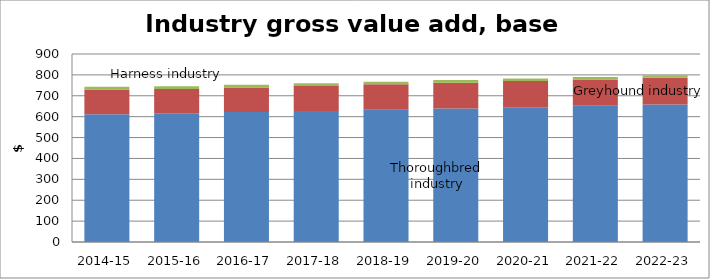
| Category | Thoroughbred industry | Greyhound industry | Harness industry |
|---|---|---|---|
| 2014-15 | 612.068 | 118.472 | 13.073 |
| 2015-16 | 616.032 | 116.561 | 12.915 |
| 2016-17 | 621.809 | 118.245 | 12.756 |
| 2017-18 | 627.668 | 119.436 | 12.597 |
| 2018-19 | 633.599 | 121.49 | 12.439 |
| 2019-20 | 639.595 | 123.143 | 12.28 |
| 2020-21 | 645.648 | 124.789 | 12.121 |
| 2021-22 | 651.752 | 126.425 | 11.963 |
| 2022-23 | 657.903 | 128.173 | 11.804 |